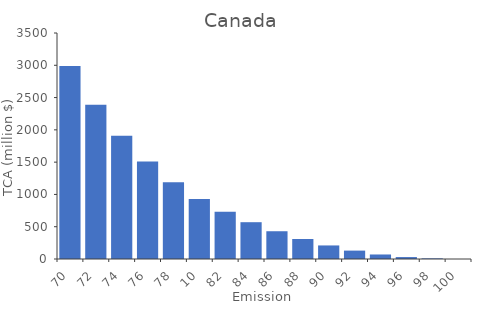
| Category | TCA (million $) |
|---|---|
| 70.0 | 2990 |
| 72.0 | 2390 |
| 74.0 | 1910 |
| 76.0 | 1510 |
| 78.0 | 1190 |
| 10.0 | 930 |
| 82.0 | 730 |
| 84.0 | 570 |
| 86.0 | 430 |
| 88.0 | 310 |
| 90.0 | 210 |
| 92.0 | 130 |
| 94.0 | 70 |
| 96.0 | 30 |
| 98.0 | 10 |
| 100.0 | 0 |